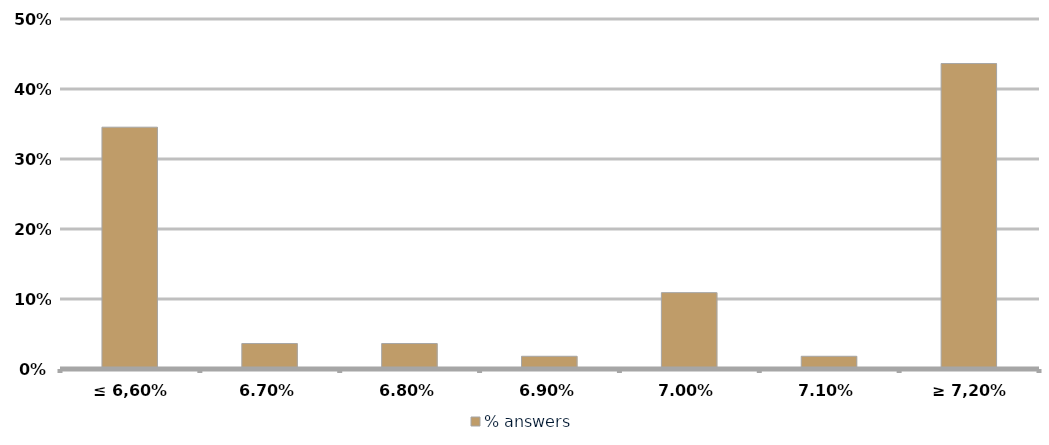
| Category | % answers |
|---|---|
| ≤ 6,60% | 0.345 |
| 6,70% | 0.036 |
| 6,80% | 0.036 |
| 6,90% | 0.018 |
| 7,00% | 0.109 |
| 7,10% | 0.018 |
| ≥ 7,20% | 0.436 |